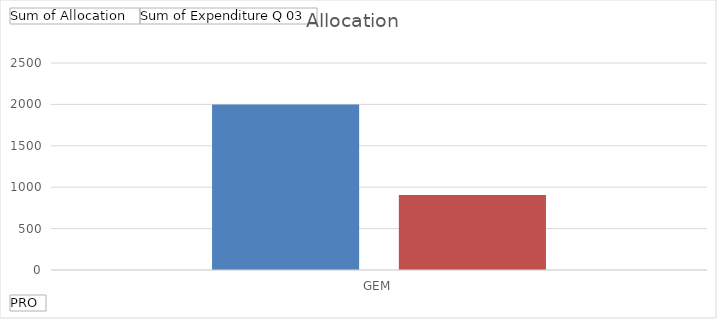
| Category | Sum of Allocation  | Sum of Expenditure Q 03 |
|---|---|---|
| GEM | 2000 | 905 |